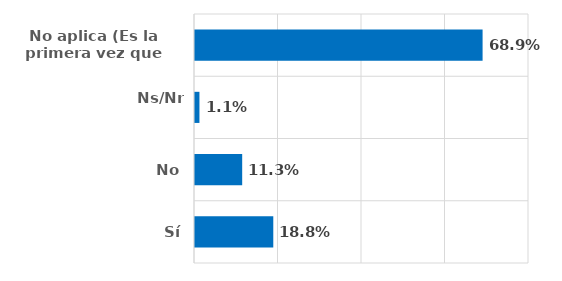
| Category | Series 0 |
|---|---|
| Sí | 0.188 |
| No | 0.113 |
| Ns/Nr | 0.011 |
| No aplica (Es la primera vez que asiste) | 0.689 |